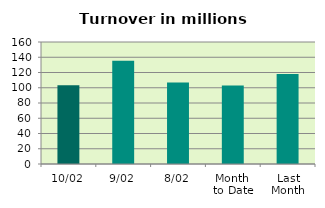
| Category | Series 0 |
|---|---|
| 10/02 | 103.136 |
| 9/02 | 135.423 |
| 8/02 | 107.001 |
| Month 
to Date | 102.89 |
| Last
Month | 118.136 |